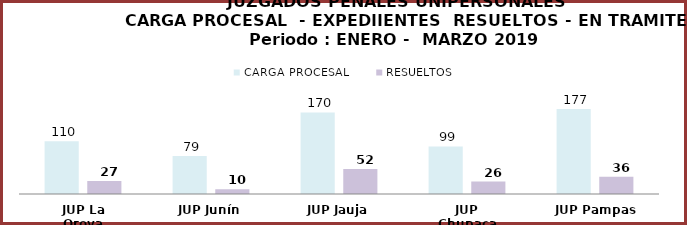
| Category | CARGA PROCESAL | RESUELTOS |
|---|---|---|
| JUP La Oroya | 110 | 27 |
| JUP Junín | 79 | 10 |
| JUP Jauja | 170 | 52 |
| JUP Chupaca | 99 | 26 |
| JUP Pampas | 177 | 36 |